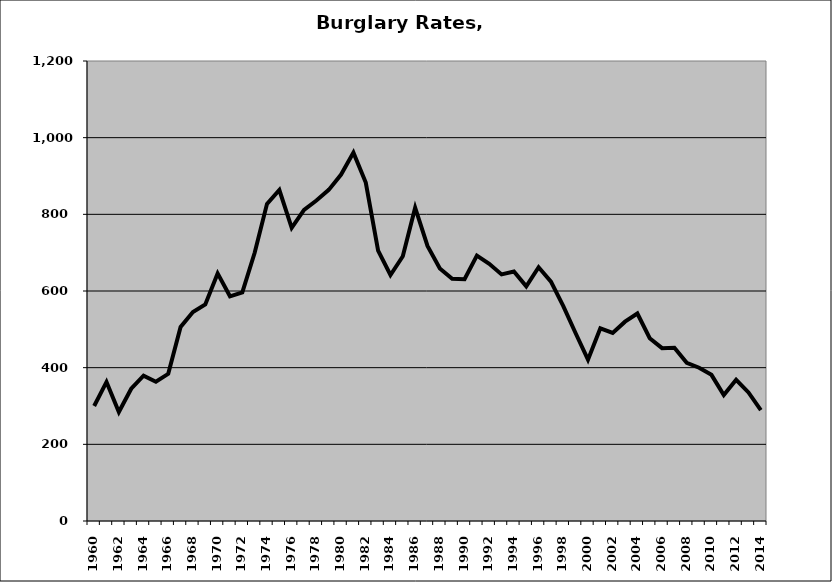
| Category | Burglary |
|---|---|
| 1960.0 | 299.94 |
| 1961.0 | 362.722 |
| 1962.0 | 284.384 |
| 1963.0 | 345.104 |
| 1964.0 | 379.3 |
| 1965.0 | 363.235 |
| 1966.0 | 383.891 |
| 1967.0 | 506.032 |
| 1968.0 | 545.079 |
| 1969.0 | 565 |
| 1970.0 | 645.877 |
| 1971.0 | 586.176 |
| 1972.0 | 596.232 |
| 1973.0 | 699.717 |
| 1974.0 | 827.298 |
| 1975.0 | 863.369 |
| 1976.0 | 764.615 |
| 1977.0 | 811.576 |
| 1978.0 | 836.085 |
| 1979.0 | 863.778 |
| 1980.0 | 903.713 |
| 1981.0 | 960.976 |
| 1982.0 | 882.869 |
| 1983.0 | 705.447 |
| 1984.0 | 641.683 |
| 1985.0 | 690.57 |
| 1986.0 | 817.357 |
| 1987.0 | 717.551 |
| 1988.0 | 658.811 |
| 1989.0 | 631.789 |
| 1990.0 | 630.969 |
| 1991.0 | 692.174 |
| 1992.0 | 671.03 |
| 1993.0 | 643.191 |
| 1994.0 | 650.63 |
| 1995.0 | 612.083 |
| 1996.0 | 661.954 |
| 1997.0 | 624.583 |
| 1998.0 | 560.499 |
| 1999.0 | 489.781 |
| 2000.0 | 420.833 |
| 2001.0 | 502.477 |
| 2002.0 | 490.748 |
| 2003.0 | 520.005 |
| 2004.0 | 541.228 |
| 2005.0 | 476.81 |
| 2006.0 | 450.87 |
| 2007.0 | 451.772 |
| 2008.0 | 412.773 |
| 2009.0 | 399.802 |
| 2010.0 | 381.281 |
| 2011.0 | 328.542 |
| 2012.0 | 368.523 |
| 2013.0 | 335.378 |
| 2014.0 | 289.137 |